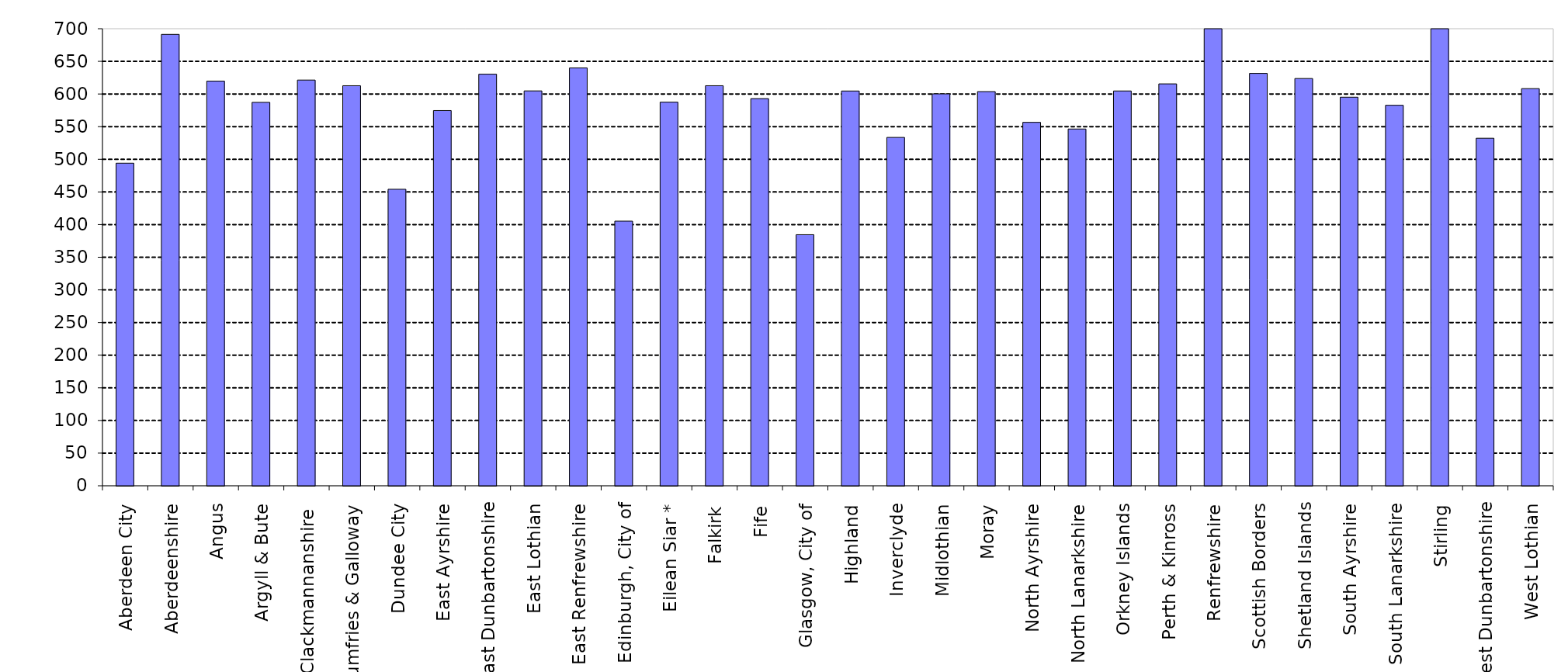
| Category | Series 0 |
|---|---|
| Aberdeen City | 494.06 |
| Aberdeenshire | 691.321 |
| Angus | 619.746 |
| Argyll & Bute | 587.231 |
| Clackmannanshire  | 621.354 |
| Dumfries & Galloway | 612.676 |
| Dundee City | 454.106 |
| East Ayrshire | 574.652 |
| East Dunbartonshire | 630.357 |
| East Lothian | 604.755 |
| East Renfrewshire | 639.912 |
| Edinburgh, City of | 405.277 |
| Eilean Siar * | 587.529 |
| Falkirk | 612.7 |
| Fife | 592.981 |
| Glasgow, City of | 384.508 |
| Highland | 604.6 |
| Inverclyde | 533.518 |
| Midlothian | 600.181 |
| Moray | 603.693 |
| North Ayrshire | 556.605 |
| North Lanarkshire | 546.378 |
| Orkney Islands | 604.659 |
| Perth & Kinross | 615.519 |
| Renfrewshire | 808.153 |
| Scottish Borders | 631.56 |
| Shetland Islands | 623.719 |
| South Ayrshire | 595.099 |
| South Lanarkshire | 582.734 |
| Stirling | 747.941 |
| West Dunbartonshire | 532.241 |
| West Lothian | 608.234 |